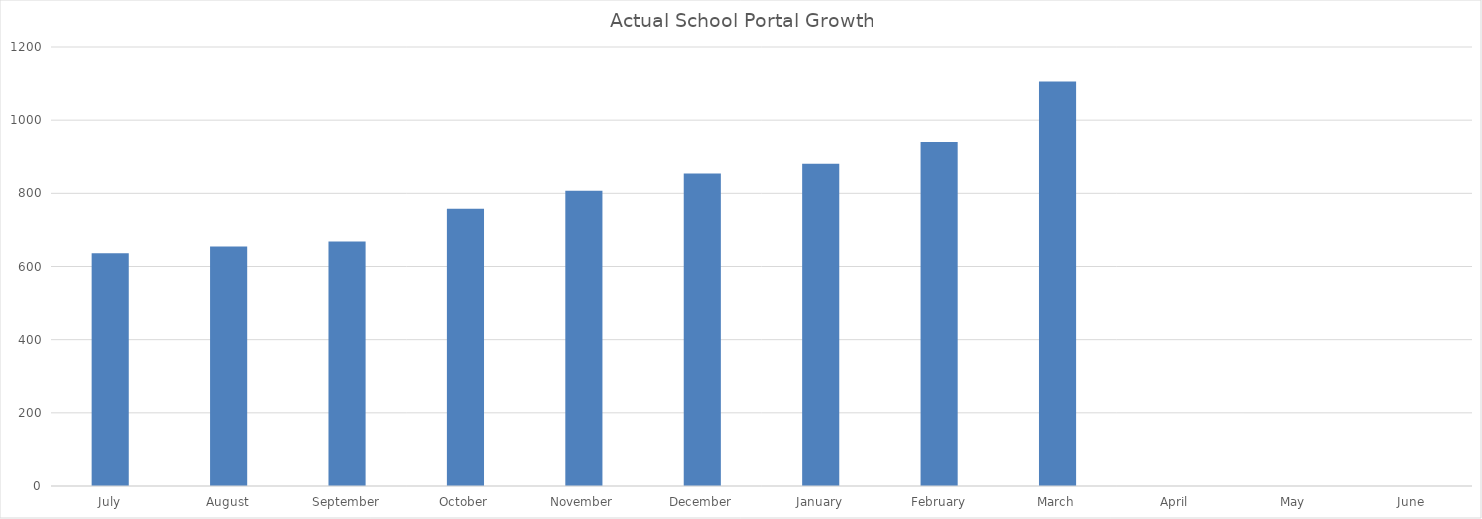
| Category | Actual School Portal Growth  |
|---|---|
| July | 636 |
| August | 655 |
| September | 668 |
| October | 758 |
| November | 807 |
| December | 854 |
| January | 881 |
| February | 940 |
| March | 1106 |
| April | 0 |
| May | 0 |
| June | 0 |